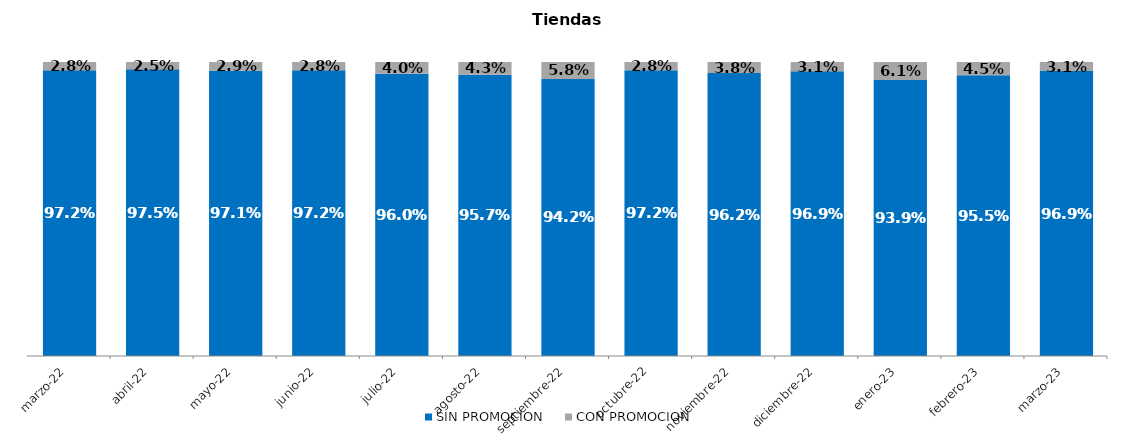
| Category | SIN PROMOCION   | CON PROMOCION   |
|---|---|---|
| 2022-03-01 | 0.972 | 0.028 |
| 2022-04-01 | 0.975 | 0.025 |
| 2022-05-01 | 0.971 | 0.029 |
| 2022-06-01 | 0.972 | 0.028 |
| 2022-07-01 | 0.96 | 0.04 |
| 2022-08-01 | 0.957 | 0.043 |
| 2022-09-01 | 0.942 | 0.058 |
| 2022-10-01 | 0.972 | 0.028 |
| 2022-11-01 | 0.962 | 0.038 |
| 2022-12-01 | 0.969 | 0.031 |
| 2023-01-01 | 0.939 | 0.061 |
| 2023-02-01 | 0.955 | 0.045 |
| 2023-03-01 | 0.969 | 0.031 |